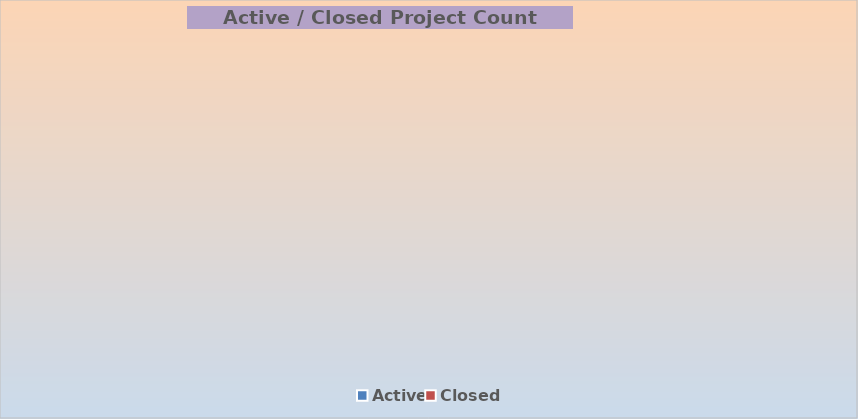
| Category | Series 0 |
|---|---|
| Active | 0 |
| Closed | 0 |